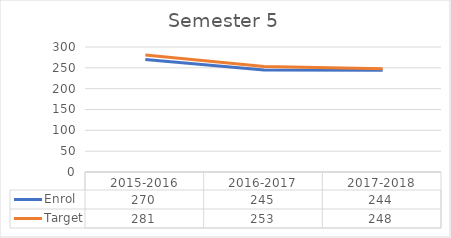
| Category | Enrol | Target |
|---|---|---|
| 2015-2016 | 270 | 281 |
| 2016-2017 | 245 | 253 |
| 2017-2018 | 244 | 248 |